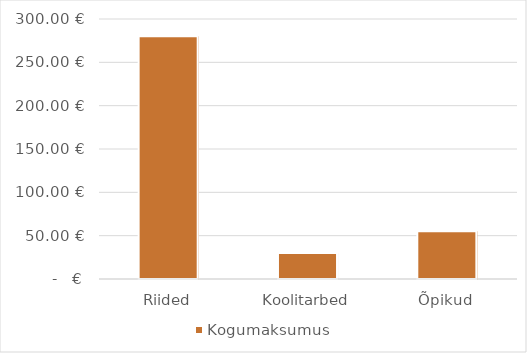
| Category | Kogumaksumus |
|---|---|
| Riided | 280 |
| Koolitarbed | 30 |
| Õpikud | 55 |